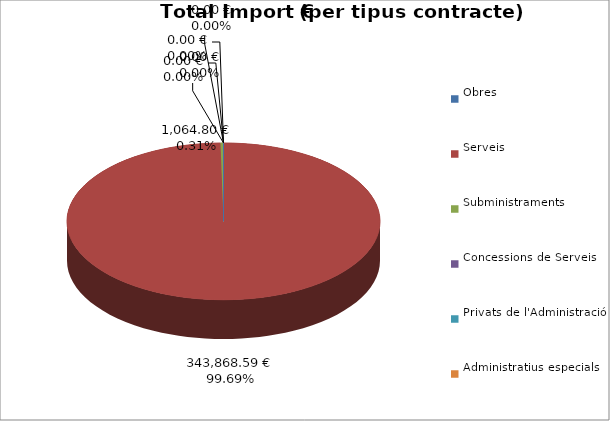
| Category | Total preu
(amb IVA) |
|---|---|
| Obres | 0 |
| Serveis | 343868.59 |
| Subministraments | 1064.8 |
| Concessions de Serveis | 0 |
| Privats de l'Administració | 0 |
| Administratius especials | 0 |